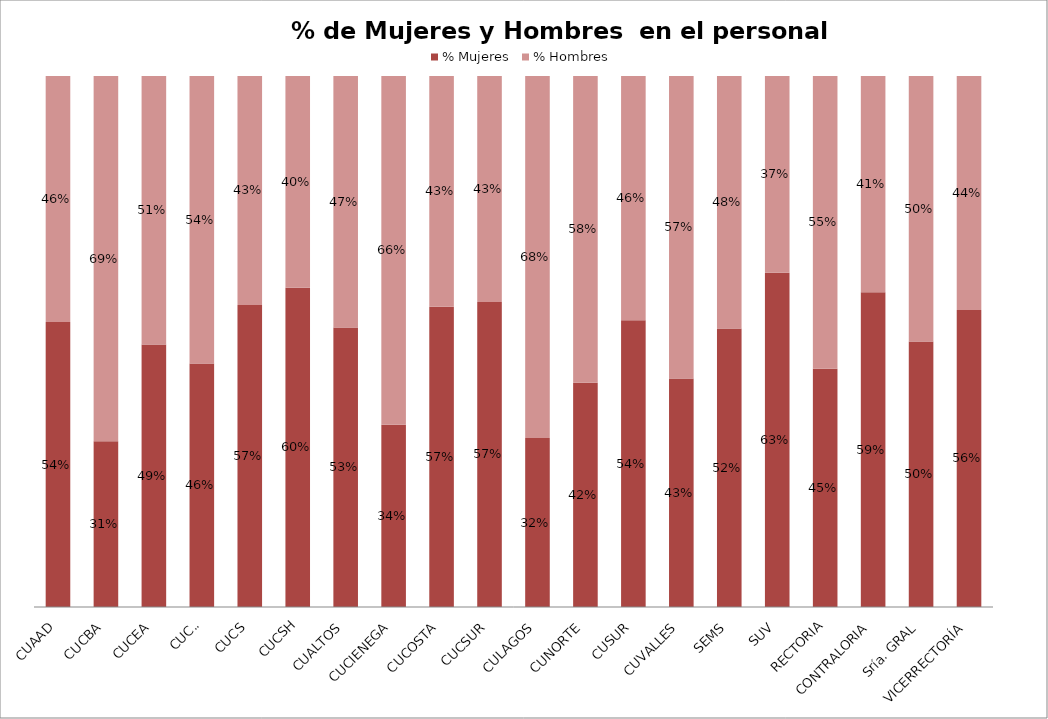
| Category | % Mujeres | % Hombres |
|---|---|---|
| CUAAD | 0.537 | 0.463 |
| CUCBA | 0.312 | 0.688 |
| CUCEA | 0.494 | 0.506 |
| CUCEI | 0.459 | 0.541 |
| CUCS | 0.569 | 0.431 |
| CUCSH | 0.601 | 0.399 |
| CUALTOS | 0.526 | 0.474 |
| CUCIENEGA | 0.343 | 0.657 |
| CUCOSTA | 0.565 | 0.435 |
| CUCSUR | 0.574 | 0.426 |
| CULAGOS | 0.318 | 0.682 |
| CUNORTE | 0.422 | 0.578 |
| CUSUR | 0.54 | 0.46 |
| CUVALLES | 0.431 | 0.569 |
| SEMS | 0.524 | 0.476 |
| SUV | 0.63 | 0.37 |
| RECTORIA | 0.449 | 0.551 |
| CONTRALORIA | 0.593 | 0.407 |
| Sría. GRAL | 0.5 | 0.5 |
| VICERRECTORÍA | 0.56 | 0.44 |